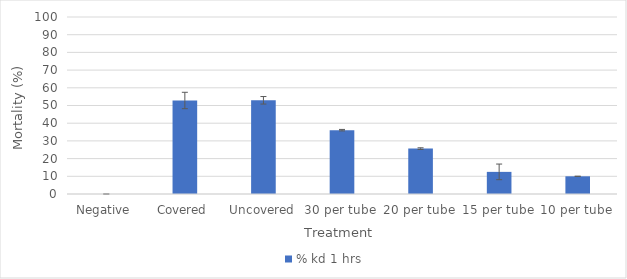
| Category | % kd 1 hrs |
|---|---|
| Negative  | 0 |
| Covered | 52.83 |
| Uncovered | 52.941 |
| 30 per tube | 36.066 |
| 20 per tube | 25.641 |
| 15 per tube | 12.5 |
| 10 per tube | 10 |